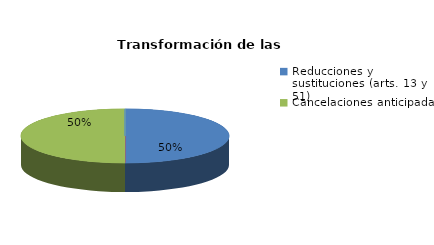
| Category | Series 0 |
|---|---|
| Reducciones y sustituciones (arts. 13 y 51) | 2 |
| Por quebrantamiento (art. 50.2) | 0 |
| Cancelaciones anticipadas | 2 |
| Traslado a Centros Penitenciarios | 0 |
| Conversión internamientos en cerrados (art. 51.2) | 0 |